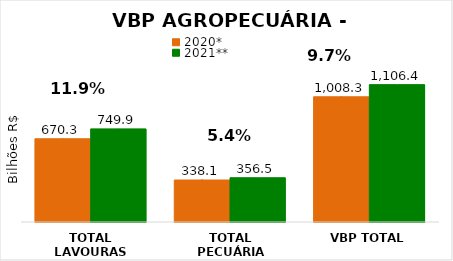
| Category | 2020* | 2021** |
|---|---|---|
| TOTAL LAVOURAS | 670.261 | 749.897 |
| TOTAL PECUÁRIA | 338.072 | 356.478 |
| VBP TOTAL | 1008.333 | 1106.375 |